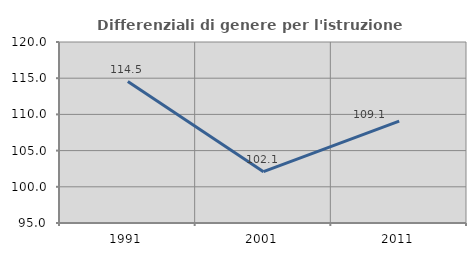
| Category | Differenziali di genere per l'istruzione superiore |
|---|---|
| 1991.0 | 114.534 |
| 2001.0 | 102.092 |
| 2011.0 | 109.06 |